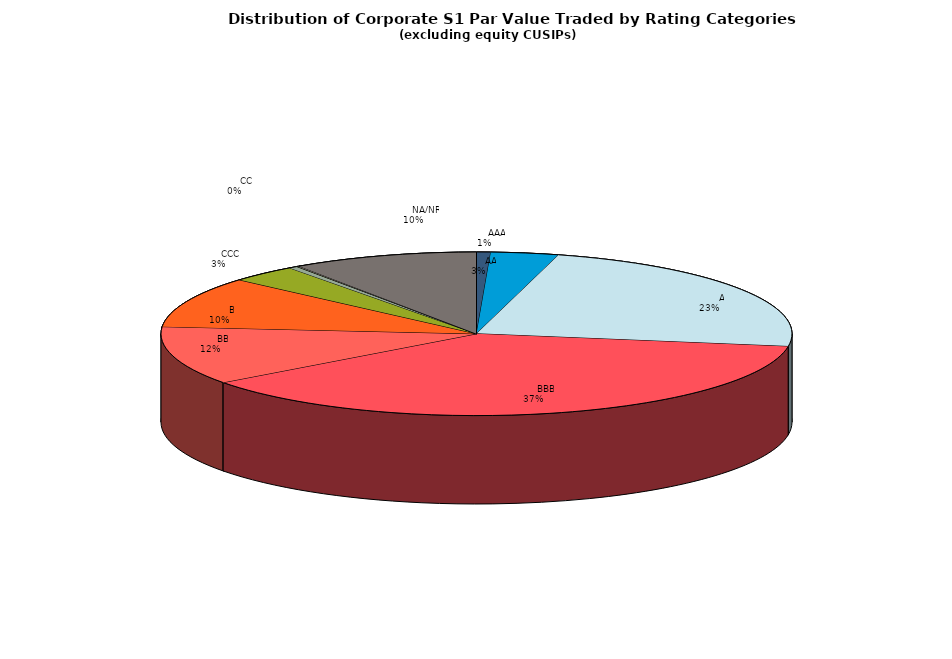
| Category | Series 0 |
|---|---|
|         AAA | 290886945.859 |
|         AA | 1398707878.531 |
|         A | 9365112249.547 |
|         BBB | 15025831071.4 |
|         BB | 4649815665.014 |
|         B | 4046773663.317 |
|         CCC | 1390687368.99 |
|         CC | 177224977.436 |
|         C | 23772776.892 |
|         D | 31683421.195 |
|         NA/NR | 3824435521.974 |